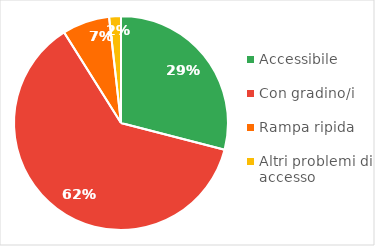
| Category | Series 0 |
|---|---|
| Accessibile | 0.29 |
| Con gradino/i | 0.621 |
| Rampa ripida | 0.071 |
| Altri problemi di accesso | 0.018 |